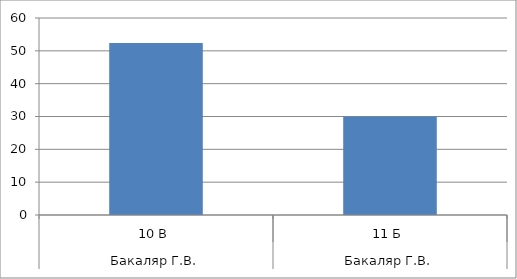
| Category | Series 0 |
|---|---|
| 0 | 52.381 |
| 1 | 30 |